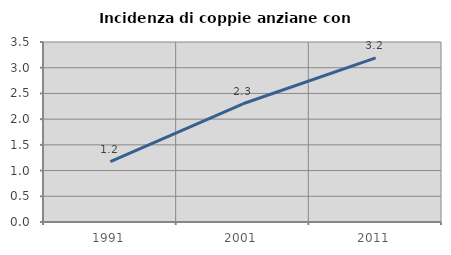
| Category | Incidenza di coppie anziane con figli |
|---|---|
| 1991.0 | 1.172 |
| 2001.0 | 2.299 |
| 2011.0 | 3.191 |